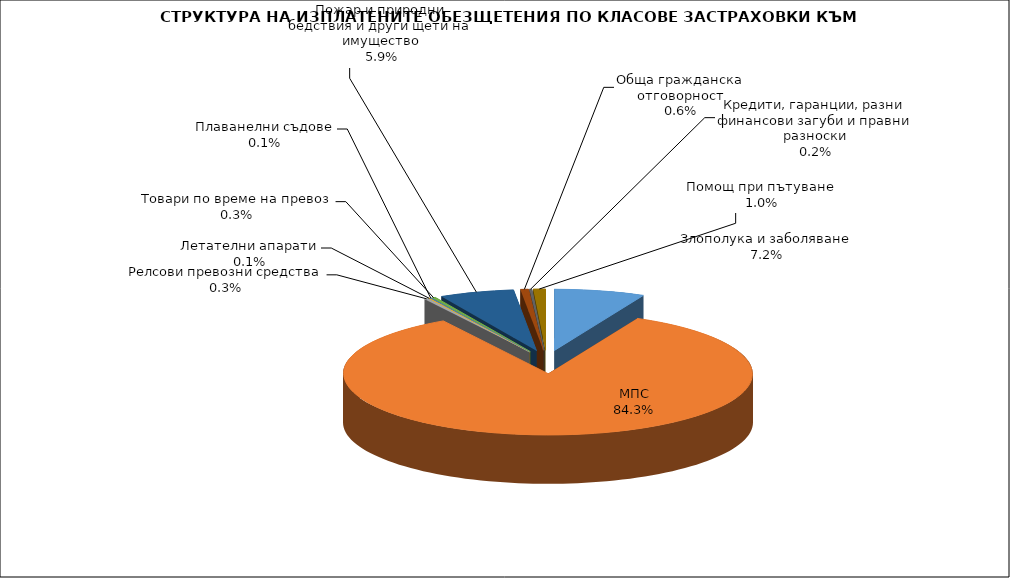
| Category | Злополука и заболяване |
|---|---|
| Злополука и заболяване | 0.072 |
| МПС | 0.843 |
| Релсови превозни средства | 0.003 |
| Летателни апарати | 0.001 |
| Плаванелни съдове | 0.001 |
| Товари по време на превоз | 0.003 |
| Пожар и природни бедствия и други щети на имущество | 0.059 |
| Обща гражданска отговорност | 0.006 |
| Кредити, гаранции, разни финансови загуби и правни разноски | 0.002 |
| Помощ при пътуване | 0.01 |